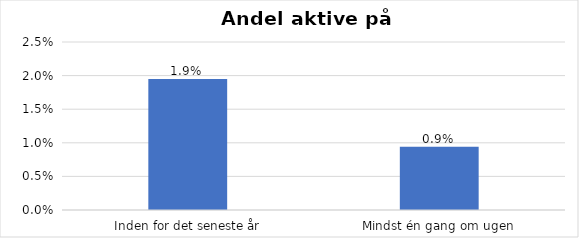
| Category | % |
|---|---|
| Inden for det seneste år | 0.019 |
| Mindst én gang om ugen | 0.009 |